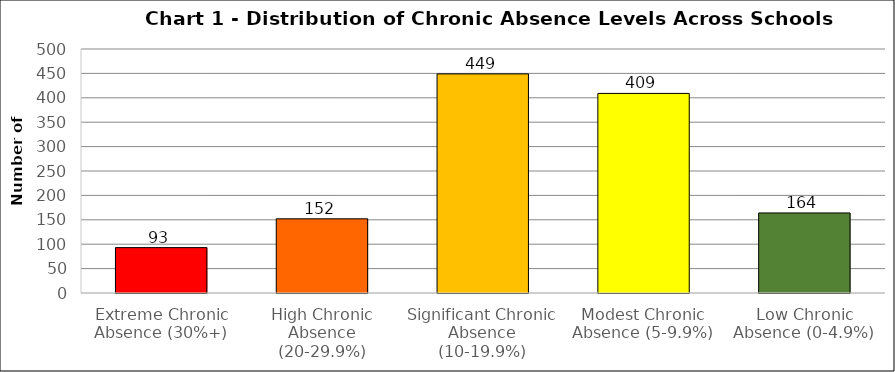
| Category | Series 0 |
|---|---|
| Extreme Chronic Absence (30%+) | 93 |
| High Chronic Absence (20-29.9%) | 152 |
| Significant Chronic Absence (10-19.9%) | 449 |
| Modest Chronic Absence (5-9.9%) | 409 |
| Low Chronic Absence (0-4.9%) | 164 |